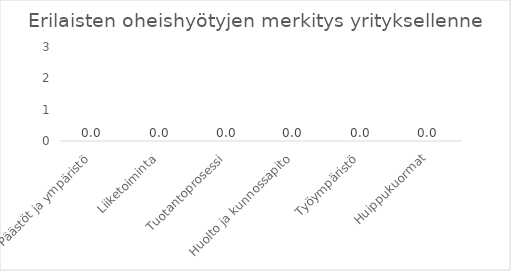
| Category | Series 0 |
|---|---|
| Päästöt ja ympäristö | 0 |
| Liiketoiminta | 0 |
| Tuotantoprosessi | 0 |
| Huolto ja kunnossapito | 0 |
| Työympäristö | 0 |
| Huippukuormat | 0 |